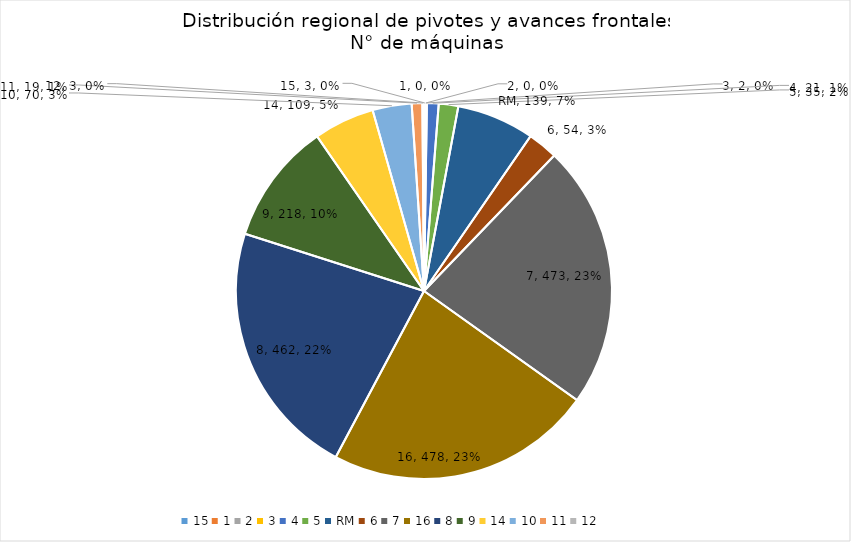
| Category | N° máquinas |
|---|---|
| 15 | 3 |
| 1 | 0 |
| 2 | 0 |
| 3 | 2 |
| 4 | 21 |
| 5 | 35 |
| RM | 139 |
| 6 | 54 |
| 7 | 473 |
| 16 | 478 |
| 8 | 462 |
| 9 | 218 |
| 14 | 109 |
| 10 | 70 |
| 11 | 19 |
| 12 | 3 |